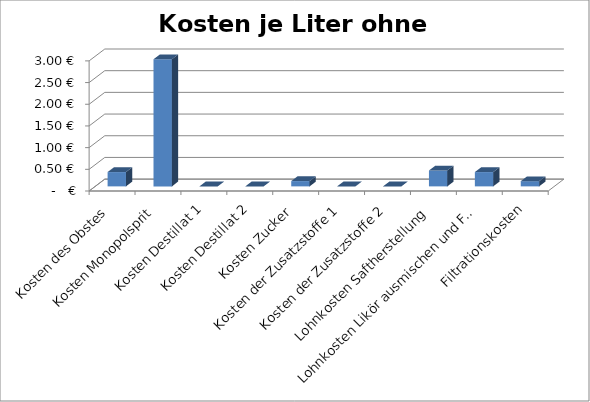
| Category | Kosten je Liter ohne Vermarktung |
|---|---|
| Kosten des Obstes | 0.33 |
| Kosten Monopolsprit | 2.93 |
| Kosten Destillat 1 | 0 |
| Kosten Destillat 2 | 0 |
| Kosten Zucker | 0.122 |
| Kosten der Zusatzstoffe 1 | 0 |
| Kosten der Zusatzstoffe 2 | 0 |
| Lohnkosten Saftherstellung | 0.366 |
| Lohnkosten Likör ausmischen und Filtern | 0.33 |
| Filtrationskosten | 0.12 |